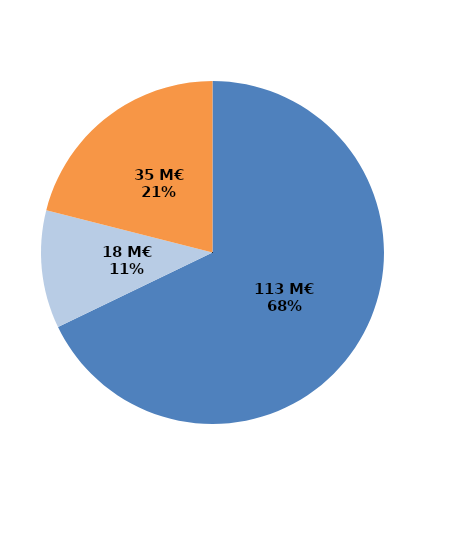
| Category | Series 0 |
|---|---|
| Formations certifiantes et pré-certifiantes | 112.568 |
| Formations professionnalisantes | 18.437 |
| Formations d'insertion sociale et professionnelle | 34.895 |